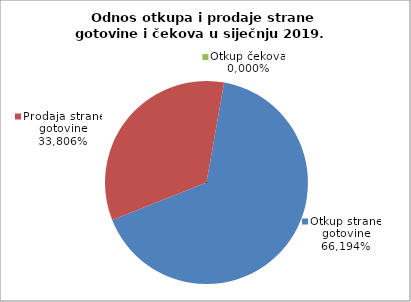
| Category | Otkup strane gotovine |
|---|---|
| 0 | 66.194 |
| 1 | 33.806 |
| 2 | 0 |